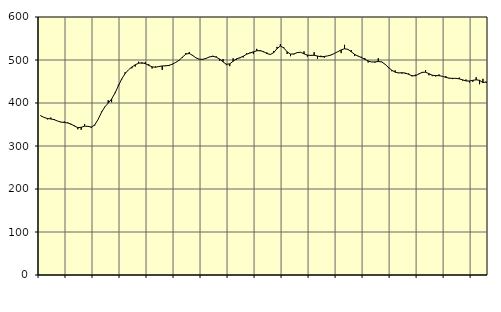
| Category | Piggar | Series 1 |
|---|---|---|
| nan | 371.2 | 370.12 |
| 87.0 | 366.7 | 366.5 |
| 87.0 | 361.9 | 363.95 |
| 87.0 | 366.2 | 362.88 |
| nan | 362.8 | 361.24 |
| 88.0 | 358.2 | 358.05 |
| 88.0 | 355.3 | 355.75 |
| 88.0 | 357 | 354.68 |
| nan | 354.8 | 353.52 |
| 89.0 | 349.2 | 350.98 |
| 89.0 | 347.4 | 346.34 |
| 89.0 | 338.9 | 342.83 |
| nan | 337.6 | 343.46 |
| 90.0 | 351.2 | 346.04 |
| 90.0 | 346.3 | 345.77 |
| 90.0 | 342 | 344.07 |
| nan | 347.7 | 348.83 |
| 91.0 | 362.1 | 361.9 |
| 91.0 | 380 | 378.06 |
| 91.0 | 390.4 | 391.03 |
| nan | 406.4 | 399.75 |
| 92.0 | 401.8 | 409.29 |
| 92.0 | 423.9 | 422.83 |
| 92.0 | 442.3 | 439.75 |
| nan | 454.7 | 455.88 |
| 93.0 | 471.4 | 468.32 |
| 93.0 | 477.1 | 477.14 |
| 93.0 | 480.5 | 483.62 |
| nan | 484.7 | 488.86 |
| 94.0 | 495.9 | 492.41 |
| 94.0 | 491.4 | 493.54 |
| 94.0 | 495.4 | 491.53 |
| nan | 490.1 | 487.62 |
| 95.0 | 480.3 | 484.05 |
| 95.0 | 485 | 483.17 |
| 95.0 | 484.4 | 484.81 |
| nan | 476.8 | 486.15 |
| 96.0 | 487.5 | 486.38 |
| 96.0 | 485.9 | 487.44 |
| 96.0 | 490 | 490.4 |
| nan | 493.9 | 494.35 |
| 97.0 | 498.6 | 499.47 |
| 97.0 | 505.2 | 506.67 |
| 97.0 | 515.9 | 513.71 |
| nan | 518.4 | 515.19 |
| 98.0 | 511.7 | 510.69 |
| 98.0 | 505.2 | 504.97 |
| 98.0 | 502.2 | 501.86 |
| nan | 500.5 | 501.54 |
| 99.0 | 503.6 | 503.77 |
| 99.0 | 507.6 | 507.08 |
| 99.0 | 509.9 | 508.47 |
| nan | 508.4 | 506.64 |
| 0.0 | 498.3 | 502.28 |
| 0.0 | 502.3 | 495.69 |
| 0.0 | 488.1 | 490.14 |
| nan | 485.7 | 491 |
| 1.0 | 503.8 | 497.09 |
| 1.0 | 500.6 | 502.7 |
| 1.0 | 504.1 | 505.24 |
| nan | 505.9 | 508.81 |
| 2.0 | 515.5 | 513.4 |
| 2.0 | 517.3 | 516.24 |
| 2.0 | 514.4 | 518.96 |
| nan | 525.9 | 521.43 |
| 3.0 | 520.5 | 521.84 |
| 3.0 | 518.3 | 519.44 |
| 3.0 | 517.5 | 515.14 |
| nan | 513.8 | 512.81 |
| 4.0 | 521 | 516.95 |
| 4.0 | 530.5 | 526.44 |
| 4.0 | 537 | 532.45 |
| nan | 529.7 | 528.13 |
| 5.0 | 514 | 518.87 |
| 5.0 | 508.9 | 513.72 |
| 5.0 | 513.1 | 514.11 |
| nan | 516.3 | 517.18 |
| 6.0 | 517.7 | 517.93 |
| 6.0 | 520 | 514.42 |
| 6.0 | 508.1 | 511.24 |
| nan | 509.4 | 510.84 |
| 7.0 | 518.2 | 510.91 |
| 7.0 | 502.9 | 509.26 |
| 7.0 | 510 | 507.58 |
| nan | 505.2 | 508.18 |
| 8.0 | 509.6 | 509.55 |
| 8.0 | 511.9 | 511.53 |
| 8.0 | 515.6 | 515.3 |
| nan | 519.3 | 519.27 |
| 9.0 | 516 | 523.38 |
| 9.0 | 535.3 | 526.19 |
| 9.0 | 525.4 | 524.84 |
| nan | 523 | 519.22 |
| 10.0 | 509.2 | 513.11 |
| 10.0 | 509.5 | 509.12 |
| 10.0 | 507.5 | 505.81 |
| nan | 504.6 | 501.72 |
| 11.0 | 494.2 | 497.81 |
| 11.0 | 495.3 | 495.49 |
| 11.0 | 493.9 | 495.51 |
| nan | 504.1 | 496.54 |
| 12.0 | 496.1 | 495.35 |
| 12.0 | 490.5 | 490.19 |
| 12.0 | 481 | 482.8 |
| nan | 473.9 | 476.23 |
| 13.0 | 475.8 | 471.67 |
| 13.0 | 469.4 | 470.04 |
| 13.0 | 468.4 | 470.37 |
| nan | 467.9 | 469.7 |
| 14.0 | 468.6 | 466.54 |
| 14.0 | 462 | 463.33 |
| 14.0 | 465.8 | 463.42 |
| nan | 468.1 | 467.23 |
| 15.0 | 470 | 471.28 |
| 15.0 | 476.2 | 471.66 |
| 15.0 | 464.5 | 468.21 |
| nan | 462.4 | 464.55 |
| 16.0 | 461.7 | 463.75 |
| 16.0 | 466.4 | 463.59 |
| 16.0 | 462.5 | 462.07 |
| nan | 462.7 | 459.66 |
| 17.0 | 456.8 | 457.76 |
| 17.0 | 455.6 | 457.36 |
| 17.0 | 457.2 | 457.35 |
| nan | 459.1 | 456.14 |
| 18.0 | 452 | 453.78 |
| 18.0 | 454.7 | 451.36 |
| 18.0 | 447.8 | 451.17 |
| nan | 449.4 | 452.7 |
| 19.0 | 459.9 | 453.89 |
| 19.0 | 443.6 | 452.79 |
| 19.0 | 456.2 | 447.32 |
| nan | 446.3 | 449.25 |